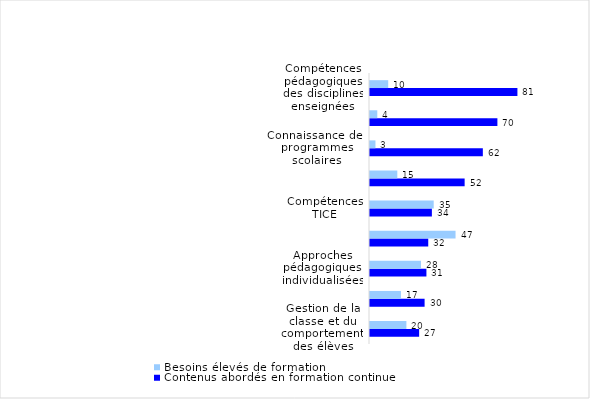
| Category | Contenus abordés en formation continue | Besoins élevés de formation |
|---|---|---|
| Gestion de la classe et du comportement des élèves | 27 | 20 |
| Enseignement de compétences transversales | 30 | 17 |
| Approches pédagogiques individualisées | 31 | 28 |
| Enseignement aux élèves ayant des besoins éducatifs particuliers | 32 | 47 |
| Compétences TICE | 34 | 35 |
| Pratiques d'évaluation des élèves | 52 | 15 |
| Connaissance des programmes scolaires | 62 | 3 |
| Connaissance et maîtrise des disciplines enseignées | 70 | 4 |
| Compétences pédagogiques des disciplines enseignées | 81 | 10 |